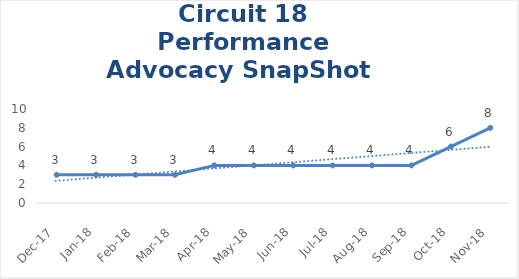
| Category | Circuit 18 |
|---|---|
| Dec-17 | 3 |
| Jan-18 | 3 |
| Feb-18 | 3 |
| Mar-18 | 3 |
| Apr-18 | 4 |
| May-18 | 4 |
| Jun-18 | 4 |
| Jul-18 | 4 |
| Aug-18 | 4 |
| Sep-18 | 4 |
| Oct-18 | 6 |
| Nov-18 | 8 |